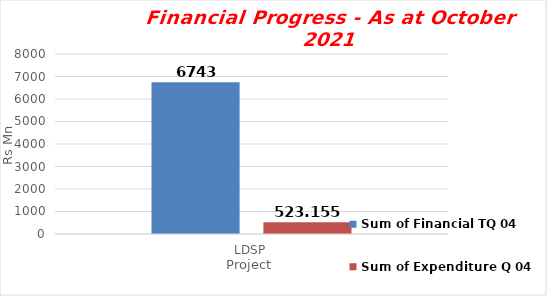
| Category | Sum of Financial TQ 04 | Sum of Expenditure Q 04 |
|---|---|---|
| LDSP | 6743 | 523.155 |